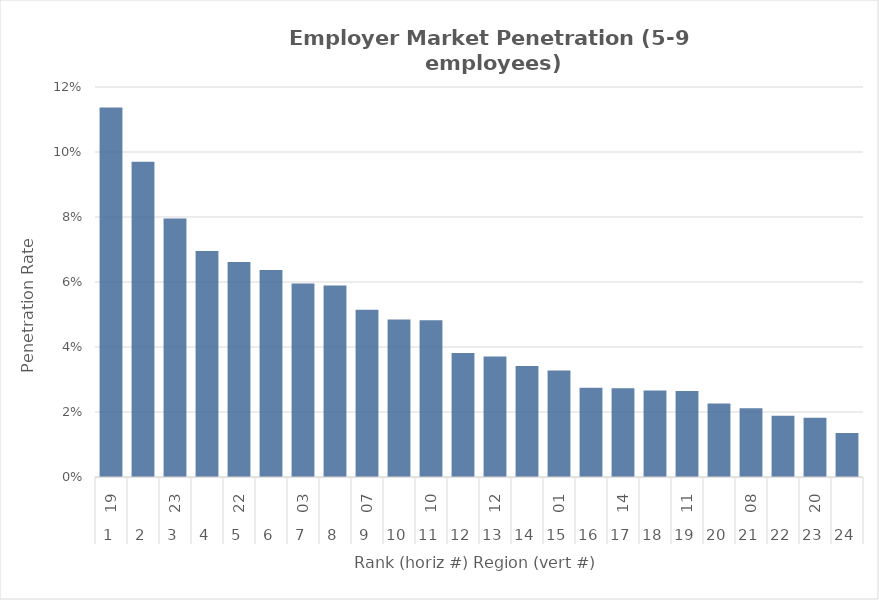
| Category | Rate |
|---|---|
| 0 | 0.114 |
| 1 | 0.097 |
| 2 | 0.08 |
| 3 | 0.07 |
| 4 | 0.066 |
| 5 | 0.064 |
| 6 | 0.06 |
| 7 | 0.059 |
| 8 | 0.051 |
| 9 | 0.048 |
| 10 | 0.048 |
| 11 | 0.038 |
| 12 | 0.037 |
| 13 | 0.034 |
| 14 | 0.033 |
| 15 | 0.027 |
| 16 | 0.027 |
| 17 | 0.027 |
| 18 | 0.026 |
| 19 | 0.023 |
| 20 | 0.021 |
| 21 | 0.019 |
| 22 | 0.018 |
| 23 | 0.014 |